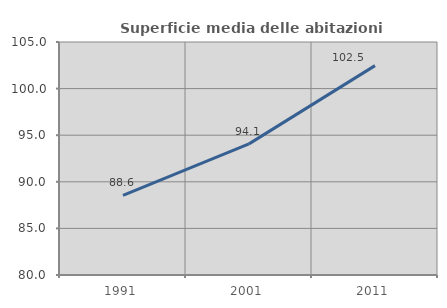
| Category | Superficie media delle abitazioni occupate |
|---|---|
| 1991.0 | 88.554 |
| 2001.0 | 94.07 |
| 2011.0 | 102.465 |